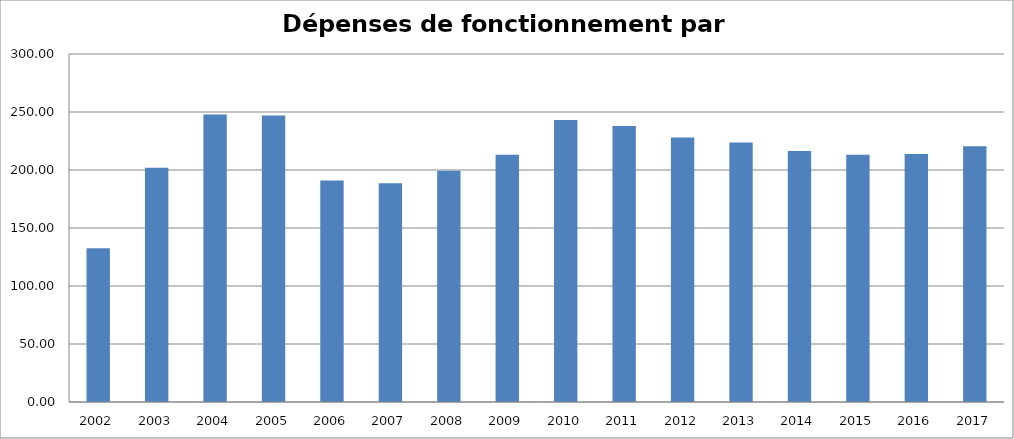
| Category | Series 0 |
|---|---|
| 2002.0 | 132.489 |
| 2003.0 | 202.036 |
| 2004.0 | 247.885 |
| 2005.0 | 247.036 |
| 2006.0 | 191.032 |
| 2007.0 | 188.63 |
| 2008.0 | 199.414 |
| 2009.0 | 213.192 |
| 2010.0 | 243.021 |
| 2011.0 | 237.962 |
| 2012.0 | 227.972 |
| 2013.0 | 223.652 |
| 2014.0 | 216.393 |
| 2015.0 | 213.2 |
| 2016.0 | 213.78 |
| 2017.0 | 220.513 |